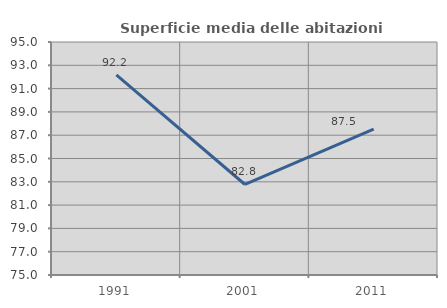
| Category | Superficie media delle abitazioni occupate |
|---|---|
| 1991.0 | 92.173 |
| 2001.0 | 82.769 |
| 2011.0 | 87.514 |